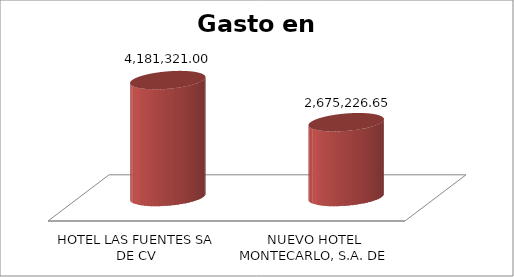
| Category | SUMA |
|---|---|
| HOTEL LAS FUENTES SA DE CV | 4181321 |
| NUEVO HOTEL MONTECARLO, S.A. DE C.V. | 2675226.65 |